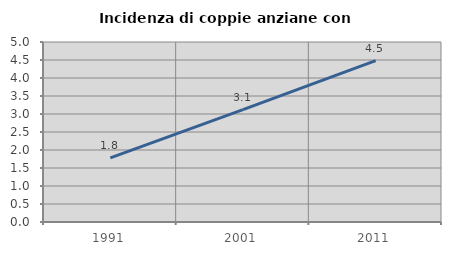
| Category | Incidenza di coppie anziane con figli |
|---|---|
| 1991.0 | 1.784 |
| 2001.0 | 3.122 |
| 2011.0 | 4.482 |